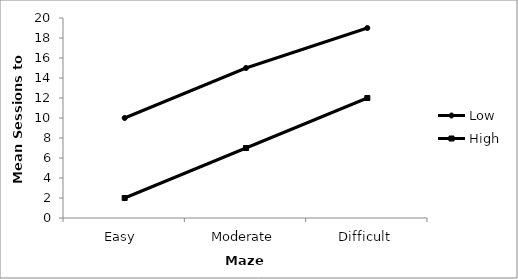
| Category | Low | High |
|---|---|---|
| Easy  | 10 | 2 |
| Moderate | 15 | 7 |
| Difficult | 19 | 12 |